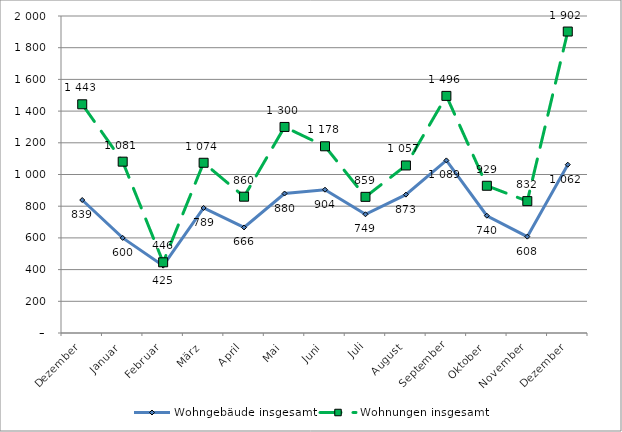
| Category | Wohngebäude insgesamt | Wohnungen insgesamt |
|---|---|---|
| Dezember | 839 | 1443 |
| Januar | 600 | 1081 |
| Februar | 425 | 446 |
| März | 789 | 1074 |
| April | 666 | 860 |
| Mai | 880 | 1300 |
| Juni | 904 | 1178 |
| Juli | 749 | 859 |
| August | 873 | 1057 |
| September | 1089 | 1496 |
| Oktober | 740 | 929 |
| November | 608 | 832 |
| Dezember | 1062 | 1902 |